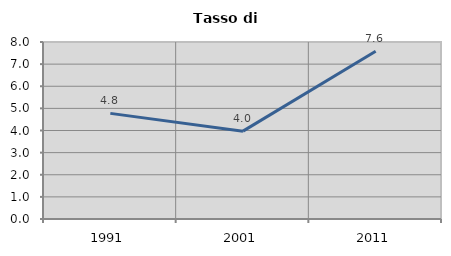
| Category | Tasso di disoccupazione   |
|---|---|
| 1991.0 | 4.774 |
| 2001.0 | 3.971 |
| 2011.0 | 7.582 |